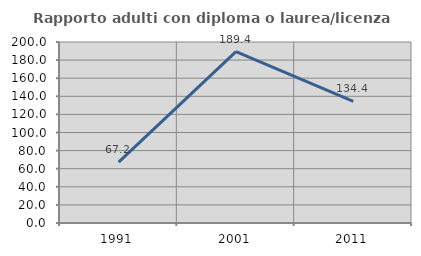
| Category | Rapporto adulti con diploma o laurea/licenza media  |
|---|---|
| 1991.0 | 67.217 |
| 2001.0 | 189.367 |
| 2011.0 | 134.423 |